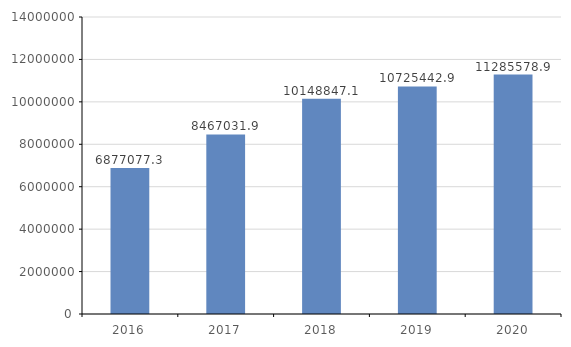
| Category | Series 0 |
|---|---|
| 2016.0 | 6877077.3 |
| 2017.0 | 8467031.9 |
| 2018.0 | 10148847.1 |
| 2019.0 | 10725442.9 |
| 2020.0 | 11285578.9 |